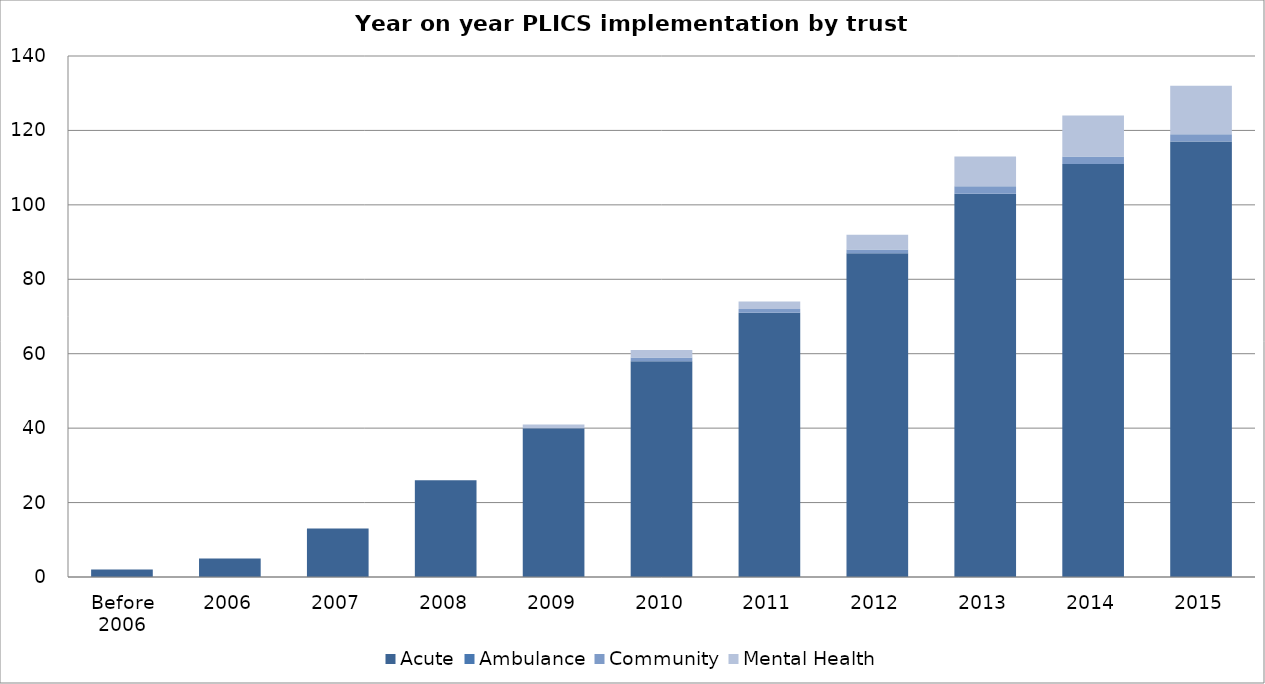
| Category | Acute | Ambulance | Community | Mental Health |
|---|---|---|---|---|
| Before 2006 | 2 | 0 | 0 | 0 |
| 2006 | 5 | 0 | 0 | 0 |
| 2007 | 13 | 0 | 0 | 0 |
| 2008 | 26 | 0 | 0 | 0 |
| 2009 | 40 | 0 | 0 | 1 |
| 2010 | 58 | 0 | 1 | 2 |
| 2011 | 71 | 0 | 1 | 2 |
| 2012 | 87 | 0 | 1 | 4 |
| 2013 | 103 | 0 | 2 | 8 |
| 2014 | 111 | 0 | 2 | 11 |
| 2015 | 117 | 0 | 2 | 13 |